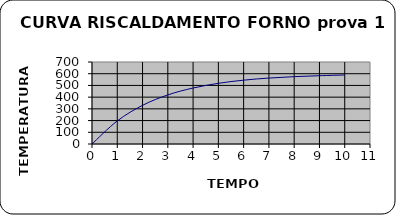
| Category | Series 0 |
|---|---|
| 0.0 | 0 |
| 1.0 | 197 |
| 2.0 | 330 |
| 3.0 | 419 |
| 4.0 | 478 |
| 5.0 | 518 |
| 6.0 | 545 |
| 7.0 | 563 |
| 8.0 | 575 |
| 9.0 | 583 |
| 10.0 | 589 |